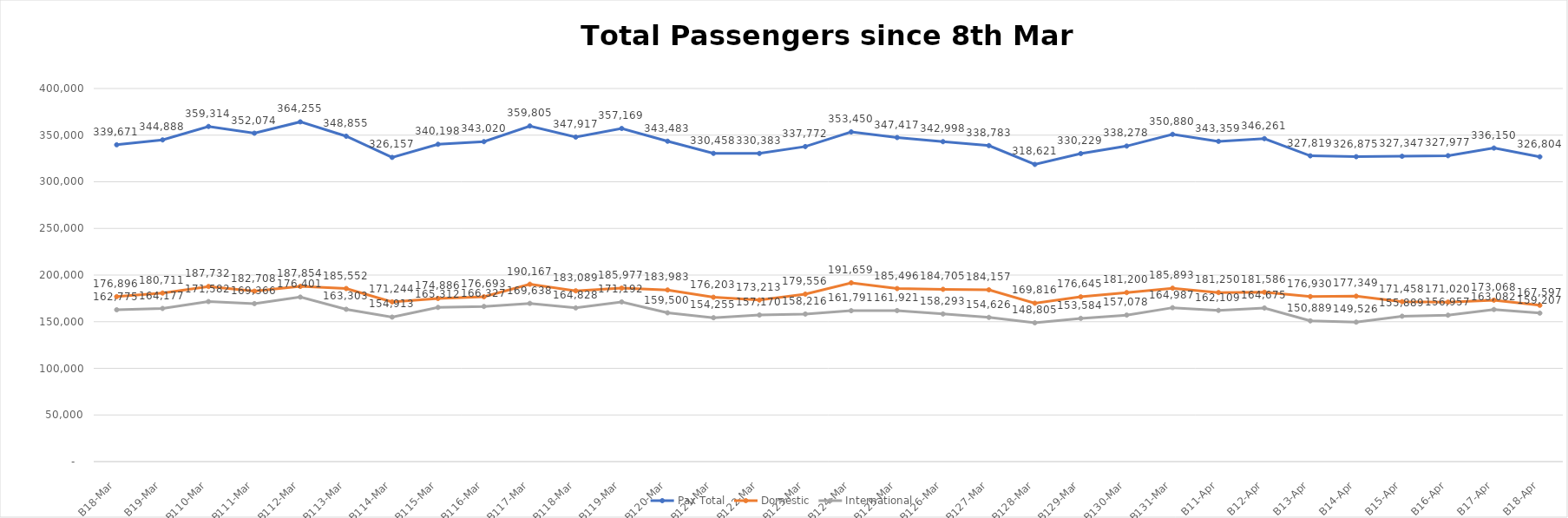
| Category | Pax Total |  Domestic  |  International  |
|---|---|---|---|
| 2023-03-08 | 339671 | 176896 | 162775 |
| 2023-03-09 | 344888 | 180711 | 164177 |
| 2023-03-10 | 359314 | 187732 | 171582 |
| 2023-03-11 | 352074 | 182708 | 169366 |
| 2023-03-12 | 364255 | 187854 | 176401 |
| 2023-03-13 | 348855 | 185552 | 163303 |
| 2023-03-14 | 326157 | 171244 | 154913 |
| 2023-03-15 | 340198 | 174886 | 165312 |
| 2023-03-16 | 343020 | 176693 | 166327 |
| 2023-03-17 | 359805 | 190167 | 169638 |
| 2023-03-18 | 347917 | 183089 | 164828 |
| 2023-03-19 | 357169 | 185977 | 171192 |
| 2023-03-20 | 343483 | 183983 | 159500 |
| 2023-03-21 | 330458 | 176203 | 154255 |
| 2023-03-22 | 330383 | 173213 | 157170 |
| 2023-03-23 | 337772 | 179556 | 158216 |
| 2023-03-24 | 353450 | 191659 | 161791 |
| 2023-03-25 | 347417 | 185496 | 161921 |
| 2023-03-26 | 342998 | 184705 | 158293 |
| 2023-03-27 | 338783 | 184157 | 154626 |
| 2023-03-28 | 318621 | 169816 | 148805 |
| 2023-03-29 | 330229 | 176645 | 153584 |
| 2023-03-30 | 338278 | 181200 | 157078 |
| 2023-03-31 | 350880 | 185893 | 164987 |
| 2023-04-01 | 343359 | 181250 | 162109 |
| 2023-04-02 | 346261 | 181586 | 164675 |
| 2023-04-03 | 327819 | 176930 | 150889 |
| 2023-04-04 | 326875 | 177349 | 149526 |
| 2023-04-05 | 327347 | 171458 | 155889 |
| 2023-04-06 | 327977 | 171020 | 156957 |
| 2023-04-07 | 336150 | 173068 | 163082 |
| 2023-04-08 | 326804 | 167597 | 159207 |